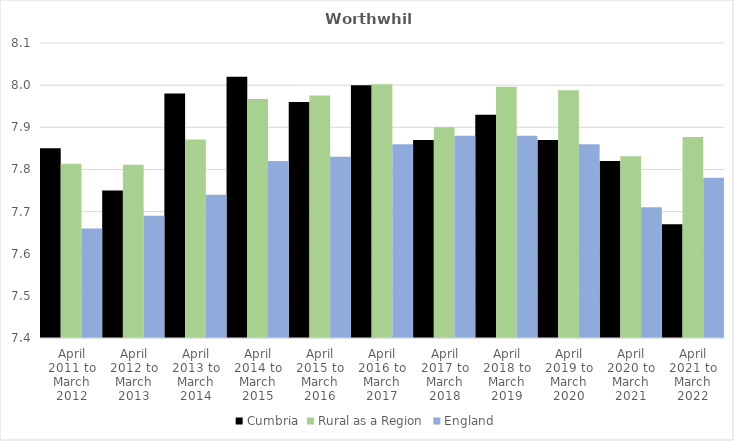
| Category | Cumbria | Rural as a Region | England |
|---|---|---|---|
| April 2011 to March 2012 | 7.85 | 7.813 | 7.66 |
| April 2012 to March 2013 | 7.75 | 7.811 | 7.69 |
| April 2013 to March 2014 | 7.98 | 7.871 | 7.74 |
| April 2014 to March 2015 | 8.02 | 7.967 | 7.82 |
| April 2015 to March 2016 | 7.96 | 7.975 | 7.83 |
| April 2016 to March 2017 | 8 | 8.002 | 7.86 |
| April 2017 to March 2018 | 7.87 | 7.9 | 7.88 |
| April 2018 to March 2019 | 7.93 | 7.996 | 7.88 |
| April 2019 to March 2020 | 7.87 | 7.988 | 7.86 |
| April 2020 to March 2021 | 7.82 | 7.831 | 7.71 |
| April 2021 to March 2022 | 7.67 | 7.877 | 7.78 |